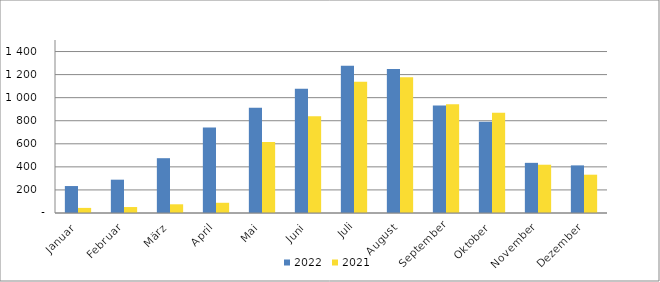
| Category | 2022 | 2021 |
|---|---|---|
| Januar | 233736 | 44193 |
| Februar | 288901 | 51745 |
| März | 475154 | 75543 |
| April | 742233 | 88628 |
| Mai | 913016 | 616132 |
| Juni | 1077843 | 839169 |
| Juli | 1277761 | 1137664 |
| August | 1248547 | 1177969 |
| September | 931669 | 942037 |
| Oktober | 792262 | 870056 |
| November | 434868 | 418550 |
| Dezember | 412847 | 332107 |